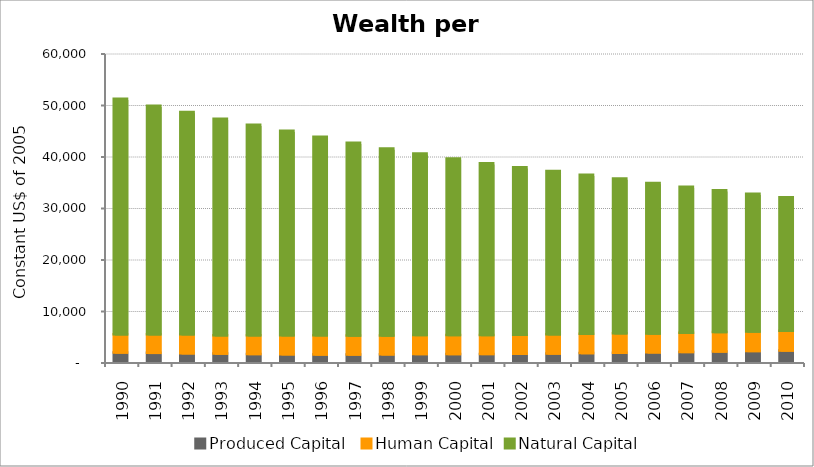
| Category | Produced Capital  | Human Capital | Natural Capital |
|---|---|---|---|
| 1990.0 | 1816.521 | 3544.4 | 45711.368 |
| 1991.0 | 1727.322 | 3603.917 | 44393.019 |
| 1992.0 | 1647.76 | 3669.031 | 43184.551 |
| 1993.0 | 1585.306 | 3564.13 | 42015.705 |
| 1994.0 | 1515.351 | 3632.946 | 40880.356 |
| 1995.0 | 1459.816 | 3698.575 | 39712.66 |
| 1996.0 | 1431.245 | 3692.287 | 38581.89 |
| 1997.0 | 1416.164 | 3685.628 | 37423.915 |
| 1998.0 | 1437.793 | 3680.258 | 36291.903 |
| 1999.0 | 1507.532 | 3674.887 | 35257.285 |
| 2000.0 | 1503.893 | 3670.607 | 34271.295 |
| 2001.0 | 1527.422 | 3683.801 | 33355.257 |
| 2002.0 | 1561.287 | 3703.821 | 32496.09 |
| 2003.0 | 1611.998 | 3727.485 | 31691.734 |
| 2004.0 | 1685.005 | 3753.017 | 30869.13 |
| 2005.0 | 1752.103 | 3779.856 | 30030.145 |
| 2006.0 | 1823.391 | 3663.612 | 29219.58 |
| 2007.0 | 1912.89 | 3704.568 | 28377.734 |
| 2008.0 | 2013.916 | 3747.025 | 27547.636 |
| 2009.0 | 2099.355 | 3789.856 | 26732.381 |
| 2010.0 | 2192.285 | 3830.91 | 25920.757 |